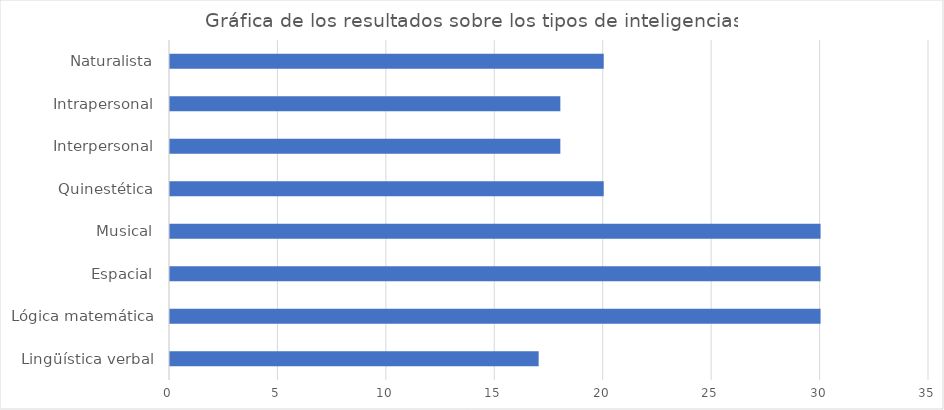
| Category | Series 0 |
|---|---|
| Lingüística verbal | 17 |
| Lógica matemática | 30 |
| Espacial | 30 |
| Musical | 30 |
| Quinestética | 20 |
| Interpersonal | 18 |
| Intrapersonal | 18 |
| Naturalista | 20 |